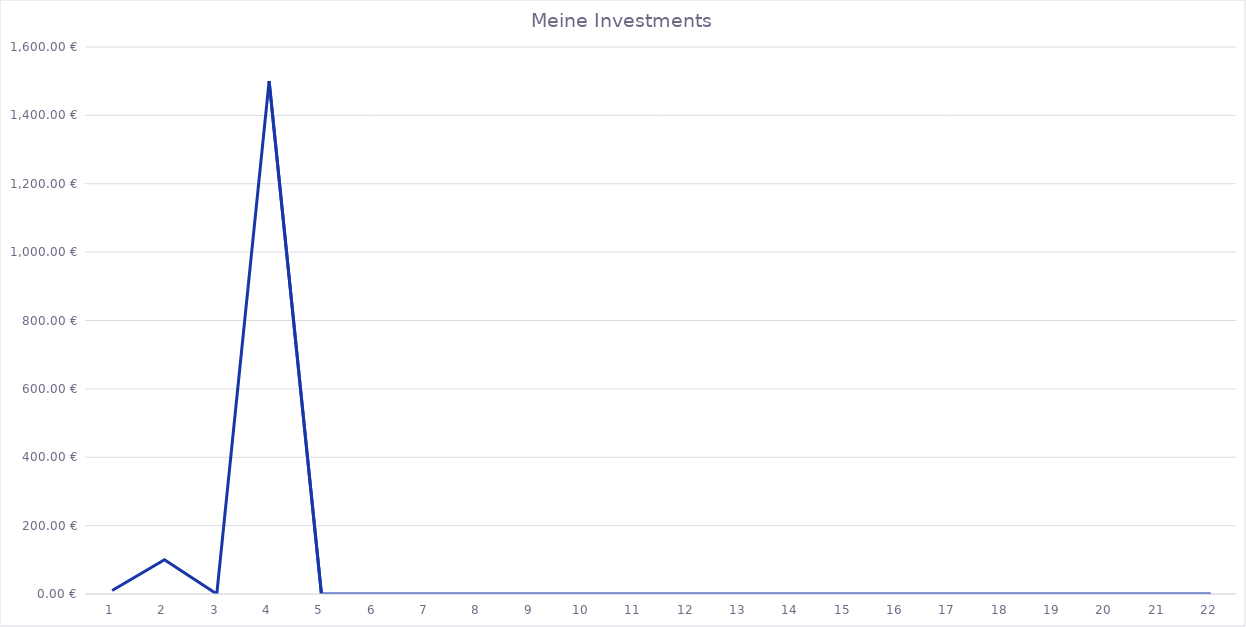
| Category | Series 0 |
|---|---|
| 0 | 10 |
| 1 | 100 |
| 2 | 0 |
| 3 | 1500 |
| 4 | 0 |
| 5 | 0 |
| 6 | 0 |
| 7 | 0 |
| 8 | 0 |
| 9 | 0 |
| 10 | 0 |
| 11 | 0 |
| 12 | 0 |
| 13 | 0 |
| 14 | 0 |
| 15 | 0 |
| 16 | 0 |
| 17 | 0 |
| 18 | 0 |
| 19 | 0 |
| 20 | 0 |
| 21 | 0 |